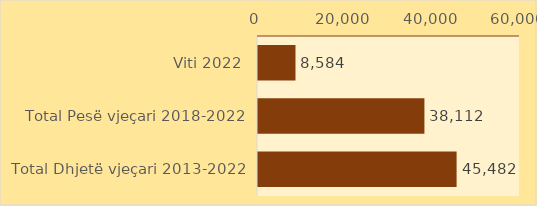
| Category | Series 0 |
|---|---|
| Viti 2022 | 8584.1 |
| Total Pesë vjeçari 2018-2022 | 38111.615 |
| Total Dhjetë vjeçari 2013-2022 | 45481.82 |